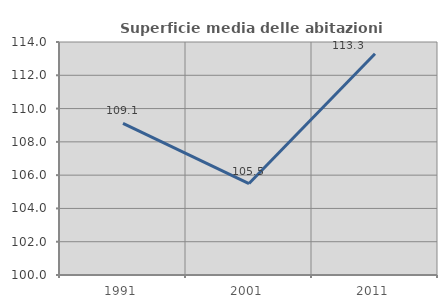
| Category | Superficie media delle abitazioni occupate |
|---|---|
| 1991.0 | 109.113 |
| 2001.0 | 105.495 |
| 2011.0 | 113.289 |